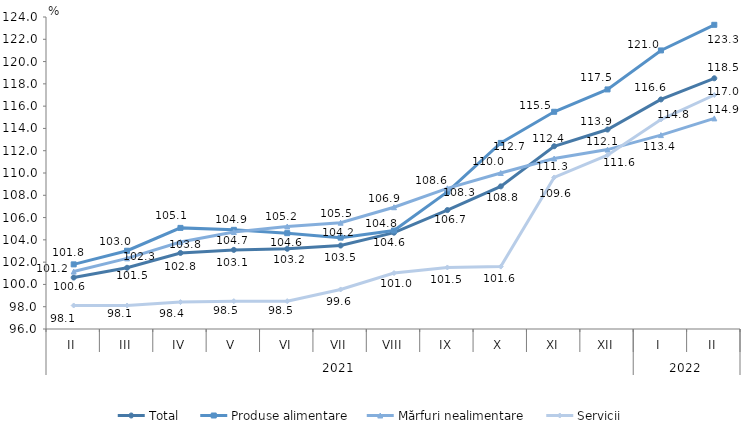
| Category | Total  | Produse alimentare | Mărfuri nealimentare  | Servicii |
|---|---|---|---|---|
| 0 | 100.619 | 101.8 | 101.154 | 98.109 |
| 1 | 101.493 | 103.024 | 102.337 | 98.107 |
| 2 | 102.826 | 105.075 | 103.801 | 98.417 |
| 3 | 103.1 | 104.9 | 104.7 | 98.5 |
| 4 | 103.2 | 104.6 | 105.2 | 98.5 |
| 5 | 103.49 | 104.2 | 105.54 | 99.55 |
| 6 | 104.645 | 104.834 | 106.928 | 101.023 |
| 7 | 106.675 | 108.308 | 108.624 | 101.521 |
| 8 | 108.8 | 112.7 | 110 | 101.6 |
| 9 | 112.4 | 115.494 | 111.3 | 109.6 |
| 10 | 113.9 | 117.5 | 112.1 | 111.6 |
| 11 | 116.6 | 121 | 113.4 | 114.8 |
| 12 | 118.5 | 123.3 | 114.9 | 117 |